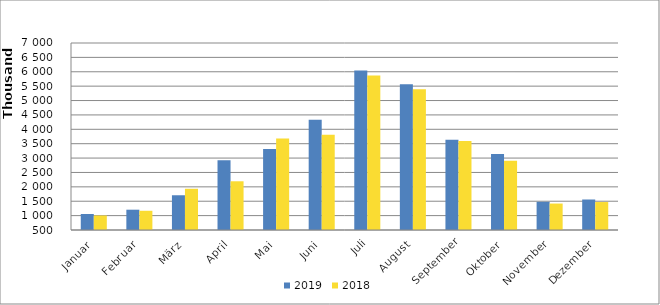
| Category | 2019 | 2018 |
|---|---|---|
| Januar | 1056116 | 1004968 |
| Februar | 1205647 | 1167815 |
| März | 1707674 | 1932720 |
| April | 2926173 | 2193481 |
| Mai | 3318785 | 3676675 |
| Juni | 4335688 | 3811829 |
| Juli | 6044743 | 5874375 |
| August | 5567222 | 5395326 |
| September | 3633060 | 3597256 |
| Oktober | 3138683 | 2907416 |
| November | 1480784 | 1419396 |
| Dezember | 1560219 | 1471894 |